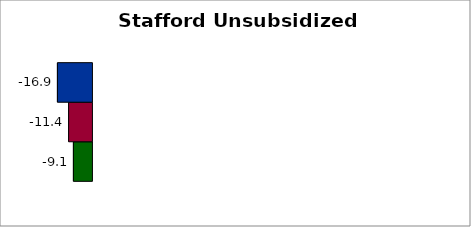
| Category | State | SREB states | 50 states and D.C. |
|---|---|---|---|
| 0 | -9.081 | -11.434 | -16.916 |